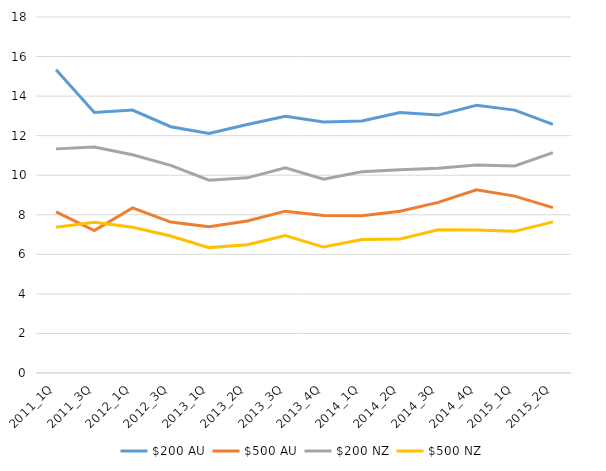
| Category | $200 AU | $500 AU | $200 NZ | $500 NZ |
|---|---|---|---|---|
| 2011_1Q | 15.331 | 8.151 | 11.332 | 7.372 |
| 2011_3Q | 13.174 | 7.2 | 11.422 | 7.628 |
| 2012_1Q | 13.294 | 8.347 | 11.034 | 7.371 |
| 2012_3Q | 12.451 | 7.632 | 10.498 | 6.924 |
| 2013_1Q | 12.106 | 7.401 | 9.751 | 6.34 |
| 2013_2Q | 12.568 | 7.682 | 9.868 | 6.489 |
| 2013_3Q | 12.983 | 8.183 | 10.377 | 6.954 |
| 2013_4Q | 12.689 | 7.962 | 9.796 | 6.367 |
| 2014_1Q | 12.747 | 7.952 | 10.173 | 6.746 |
| 2014_2Q | 13.168 | 8.178 | 10.273 | 6.772 |
| 2014_3Q | 13.041 | 8.625 | 10.358 | 7.237 |
| 2014_4Q | 13.541 | 9.264 | 10.52 | 7.23 |
| 2015_1Q | 13.291 | 8.943 | 10.47 | 7.163 |
| 2015_2Q | 12.574 | 8.365 | 11.139 | 7.642 |